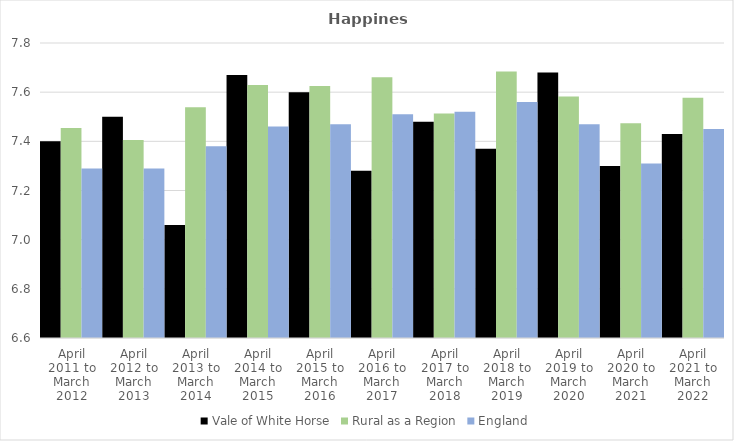
| Category | Vale of White Horse | Rural as a Region | England |
|---|---|---|---|
| April 2011 to March 2012 | 7.4 | 7.454 | 7.29 |
| April 2012 to March 2013 | 7.5 | 7.406 | 7.29 |
| April 2013 to March 2014 | 7.06 | 7.539 | 7.38 |
| April 2014 to March 2015 | 7.67 | 7.63 | 7.46 |
| April 2015 to March 2016 | 7.6 | 7.625 | 7.47 |
| April 2016 to March 2017 | 7.28 | 7.661 | 7.51 |
| April 2017 to March 2018 | 7.48 | 7.513 | 7.52 |
| April 2018 to March 2019 | 7.37 | 7.684 | 7.56 |
| April 2019 to March 2020 | 7.68 | 7.582 | 7.47 |
| April 2020 to March 2021 | 7.3 | 7.474 | 7.31 |
| April 2021 to March 2022 | 7.43 | 7.577 | 7.45 |